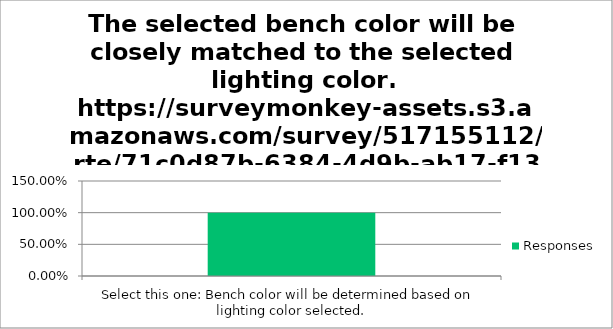
| Category | Responses |
|---|---|
| Select this one: Bench color will be determined based on lighting color selected. | 1 |